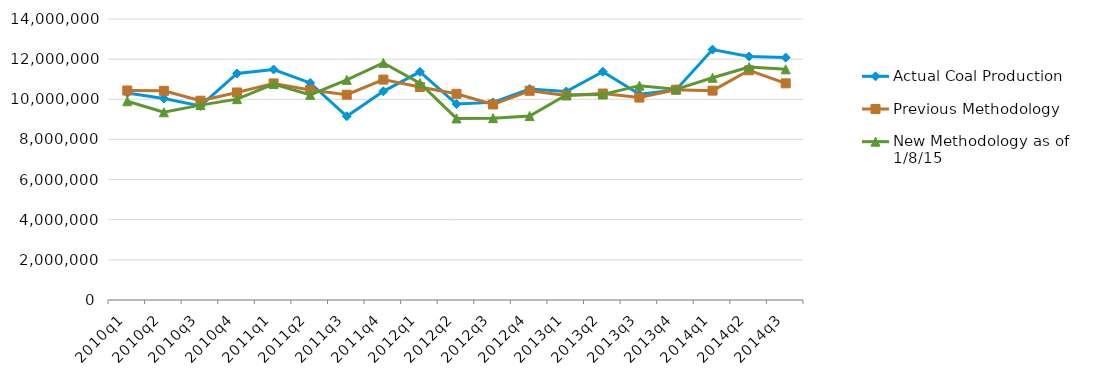
| Category | Actual Coal Production | Previous Methodology | New Methodology as of 1/8/15 |
|---|---|---|---|
| 2010q1 | 10312849 | 10437588 | 9903369 |
| 2010q2 | 10038908 | 10419308 | 9351373 |
| 2010q3 | 9667533 | 9929412 | 9709512 |
| 2010q4 | 11286850 | 10339436 | 10008780 |
| 2011q1 | 11484338 | 10790791 | 10759323 |
| 2011q2 | 10813811 | 10461258 | 10220069 |
| 2011q3 | 9154533 | 10227534 | 10968206 |
| 2011q4 | 10396070 | 10979780 | 11812257 |
| 2012q1 | 11366546 | 10612851 | 10805638 |
| 2012q2 | 9763729 | 10274030 | 9048538 |
| 2012q3 | 9845811 | 9742400 | 9059079 |
| 2012q4 | 10513344 | 10423472 | 9166369 |
| 2013q1 | 10389407 | 10189254 | 10217314 |
| 2013q2 | 11373209 | 10287081 | 10237480 |
| 2013q3 | 10249694 | 10084673 | 10679188 |
| 2013q4 | 10467079 | 10476581 | 10495133 |
| 2014q1 | 12477430 | 10430972 | 11071305 |
| 2014q2 | 12131924 | 11445393 | 11606216 |
| 2014q3 | 12075935 | 10794320 | 11491067 |